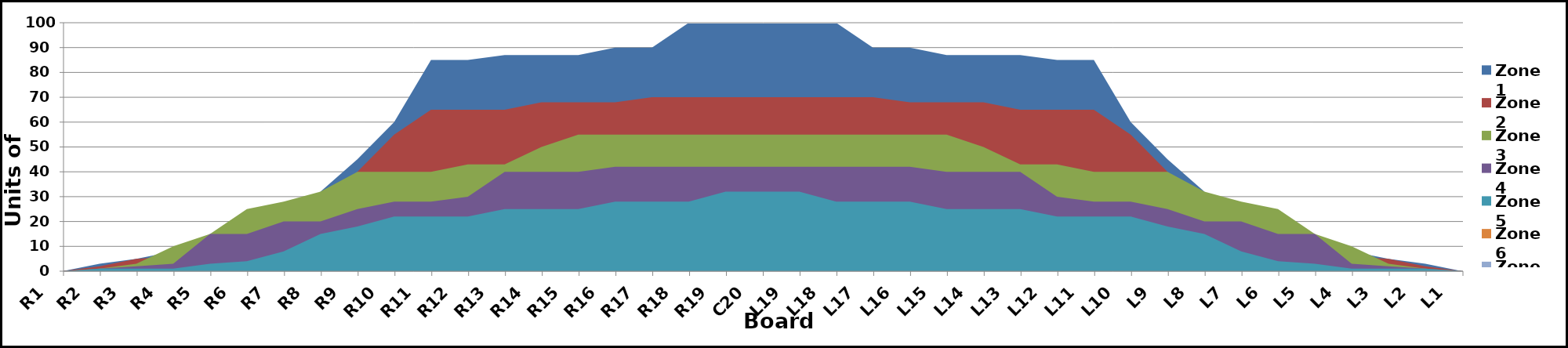
| Category | Zone 1 | Zone 2 | Zone 3 | Zone 4 | Zone 5 | Zone 6 | Zone 7 | Zone 8 |
|---|---|---|---|---|---|---|---|---|
| L1 | 0 | 0 | 0 | 0 | 0 | 0 |  |  |
| L2 | 3 | 2 | 1 | 1 | 1 | 0 |  |  |
| L3 | 5 | 5 | 3 | 2 | 1 | 0 |  |  |
| L4 | 8 | 6 | 10 | 3 | 1 | 0 |  |  |
| L5 | 14 | 12 | 15 | 15 | 3 | 0 |  |  |
| L6 | 18 | 16 | 25 | 15 | 4 | 0 |  |  |
| L7 | 20 | 18 | 28 | 20 | 8 | 0 |  |  |
| L8 | 32 | 28 | 32 | 20 | 15 | 0 |  |  |
| L9 | 45 | 40 | 40 | 25 | 18 | 0 |  |  |
| L10 | 60 | 55 | 40 | 28 | 22 | 0 |  |  |
| L11 | 85 | 65 | 40 | 28 | 22 | 0 |  |  |
| L12 | 85 | 65 | 43 | 30 | 22 | 0 |  |  |
| L13 | 87 | 65 | 43 | 40 | 25 | 0 |  |  |
| L14 | 87 | 68 | 50 | 40 | 25 | 0 |  |  |
| L15 | 87 | 68 | 55 | 40 | 25 | 0 |  |  |
| L16 | 90 | 68 | 55 | 42 | 28 | 0 |  |  |
| L17 | 90 | 70 | 55 | 42 | 28 | 0 |  |  |
| L18 | 100 | 70 | 55 | 42 | 28 | 0 |  |  |
| L19 | 100 | 70 | 55 | 42 | 32 | 0 |  |  |
| C20 | 100 | 70 | 55 | 42 | 32 | 0 |  |  |
| R19 | 100 | 70 | 55 | 42 | 32 | 0 |  |  |
| R18 | 100 | 70 | 55 | 42 | 28 | 0 |  |  |
| R17 | 90 | 70 | 55 | 42 | 28 | 0 |  |  |
| R16 | 90 | 68 | 55 | 42 | 28 | 0 |  |  |
| R15 | 87 | 68 | 55 | 40 | 25 | 0 |  |  |
| R14 | 87 | 68 | 50 | 40 | 25 | 0 |  |  |
| R13 | 87 | 65 | 43 | 40 | 25 | 0 |  |  |
| R12 | 85 | 65 | 43 | 30 | 22 | 0 |  |  |
| R11 | 85 | 65 | 40 | 28 | 22 | 0 |  |  |
| R10 | 60 | 55 | 40 | 28 | 22 | 0 |  |  |
| R9 | 45 | 40 | 40 | 25 | 18 | 0 |  |  |
| R8 | 32 | 28 | 32 | 20 | 15 | 0 |  |  |
| R7 | 20 | 18 | 28 | 20 | 8 | 0 |  |  |
| R6 | 18 | 16 | 25 | 15 | 4 | 0 |  |  |
| R5 | 14 | 12 | 15 | 15 | 3 | 0 |  |  |
| R4 | 8 | 6 | 10 | 3 | 1 | 0 |  |  |
| R3 | 5 | 5 | 3 | 2 | 1 | 0 |  |  |
| R2 | 3 | 2 | 1 | 1 | 1 | 0 |  |  |
| R1 | 0 | 0 | 0 | 0 | 0 | 0 |  |  |